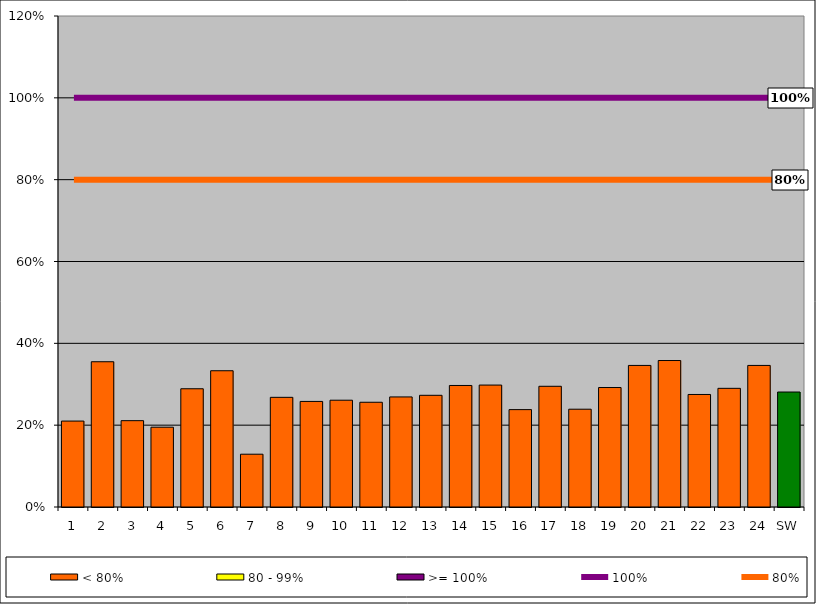
| Category | < 80% | 80 - 99% | >= 100% |
|---|---|---|---|
| 1 | 0.21 | 0 | 0 |
| 2 | 0.355 | 0 | 0 |
| 3 | 0.211 | 0 | 0 |
| 4 | 0.195 | 0 | 0 |
| 5 | 0.289 | 0 | 0 |
| 6 | 0.333 | 0 | 0 |
| 7 | 0.129 | 0 | 0 |
| 8 | 0.268 | 0 | 0 |
| 9 | 0.258 | 0 | 0 |
| 10 | 0.261 | 0 | 0 |
| 11 | 0.256 | 0 | 0 |
| 12 | 0.269 | 0 | 0 |
| 13 | 0.273 | 0 | 0 |
| 14 | 0.297 | 0 | 0 |
| 15 | 0.298 | 0 | 0 |
| 16 | 0.238 | 0 | 0 |
| 17 | 0.295 | 0 | 0 |
| 18 | 0.239 | 0 | 0 |
| 19 | 0.292 | 0 | 0 |
| 20 | 0.346 | 0 | 0 |
| 21 | 0.358 | 0 | 0 |
| 22 | 0.275 | 0 | 0 |
| 23 | 0.29 | 0 | 0 |
| 24 | 0.346 | 0 | 0 |
| SW | 0.281 | 0 | 0 |